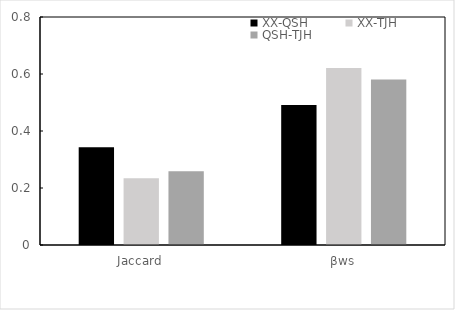
| Category | XX-QSH | XX-TJH | QSH-TJH |
|---|---|---|---|
| Jaccard | 0.343 | 0.234 | 0.259 |
| βws | 0.491 | 0.621 | 0.581 |